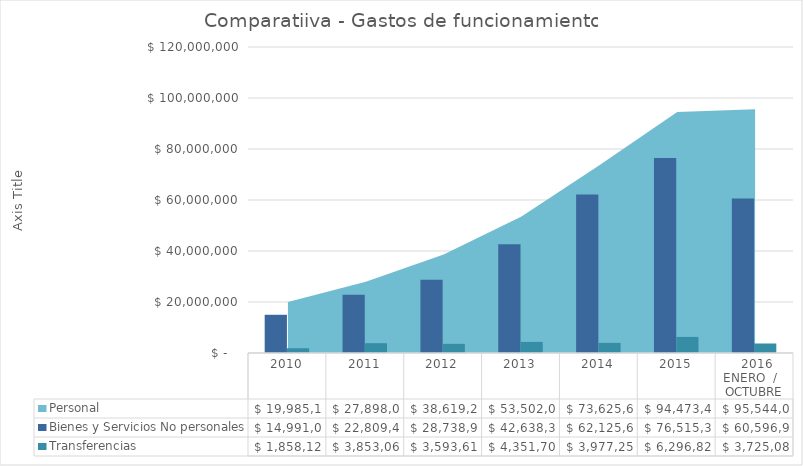
| Category | Bienes y Servicios No personales | Transferencias  |
|---|---|---|
| 2010 | 14991078.27 | 1858120.78 |
| 2011 | 22809496.37 | 3853069.1 |
| 2012 | 28738901.92 | 3593610.81 |
| 2013 | 42638388.92 | 4351705.79 |
| 2014 | 62125659.31 | 3977256.91 |
| 2015 | 76515388.17 | 6296825.31 |
|  2016 ENERO  /   OCTUBRE | 60596946.45 | 3725086.94 |